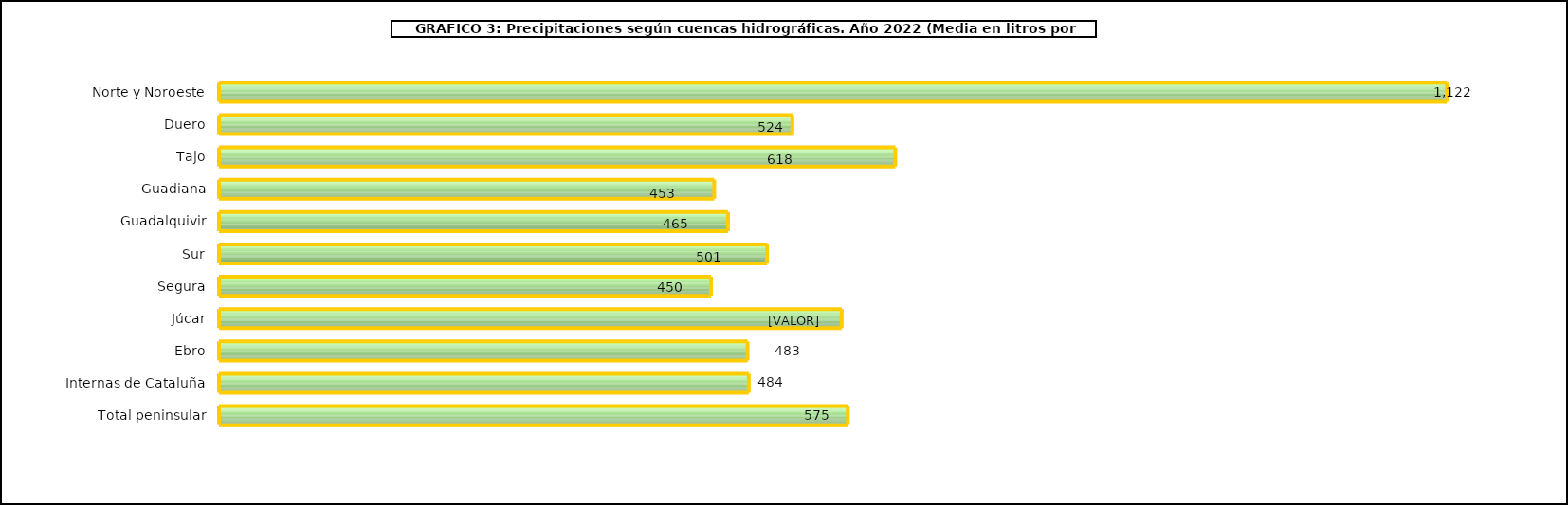
| Category | cuencas |
|---|---|
| 0 | 1122.2 |
| 1 | 524 |
| 2 | 618.1 |
| 3 | 452.6 |
| 4 | 465.2 |
| 5 | 500.9 |
| 6 | 449.7 |
| 7 | 569.1 |
| 8 | 483.1 |
| 9 | 484.2 |
| 10 | 574.7 |